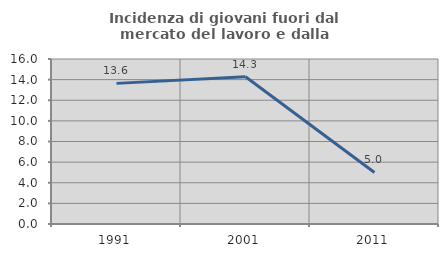
| Category | Incidenza di giovani fuori dal mercato del lavoro e dalla formazione  |
|---|---|
| 1991.0 | 13.636 |
| 2001.0 | 14.286 |
| 2011.0 | 5 |